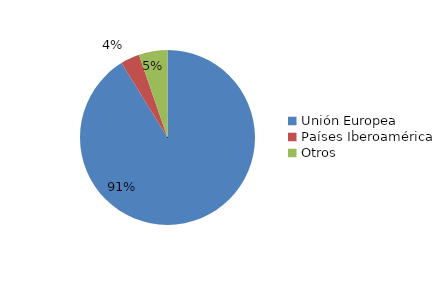
| Category | Series 0 |
|---|---|
| Unión Europea | 5819 |
| Países Iberoamérica | 225 |
| Otros | 338 |